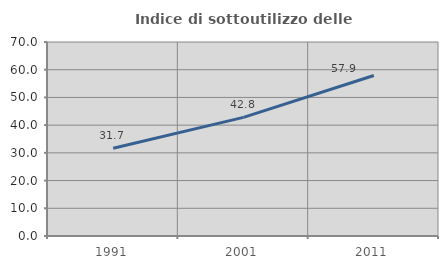
| Category | Indice di sottoutilizzo delle abitazioni  |
|---|---|
| 1991.0 | 31.69 |
| 2001.0 | 42.788 |
| 2011.0 | 57.895 |